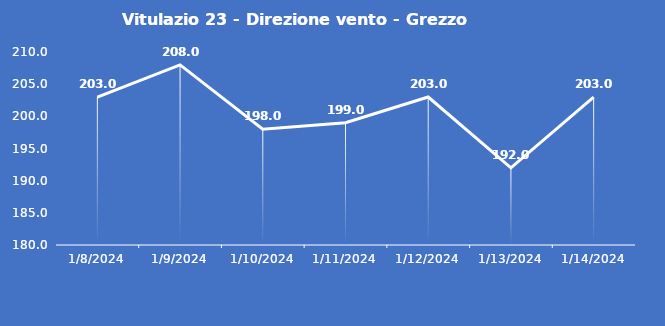
| Category | Vitulazio 23 - Direzione vento - Grezzo (°N) |
|---|---|
| 1/8/24 | 203 |
| 1/9/24 | 208 |
| 1/10/24 | 198 |
| 1/11/24 | 199 |
| 1/12/24 | 203 |
| 1/13/24 | 192 |
| 1/14/24 | 203 |